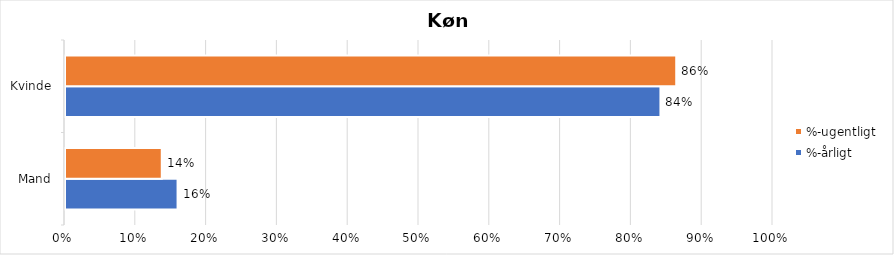
| Category | %-årligt | %-ugentligt |
|---|---|---|
| Mand | 0.159 | 0.137 |
| Kvinde | 0.841 | 0.863 |